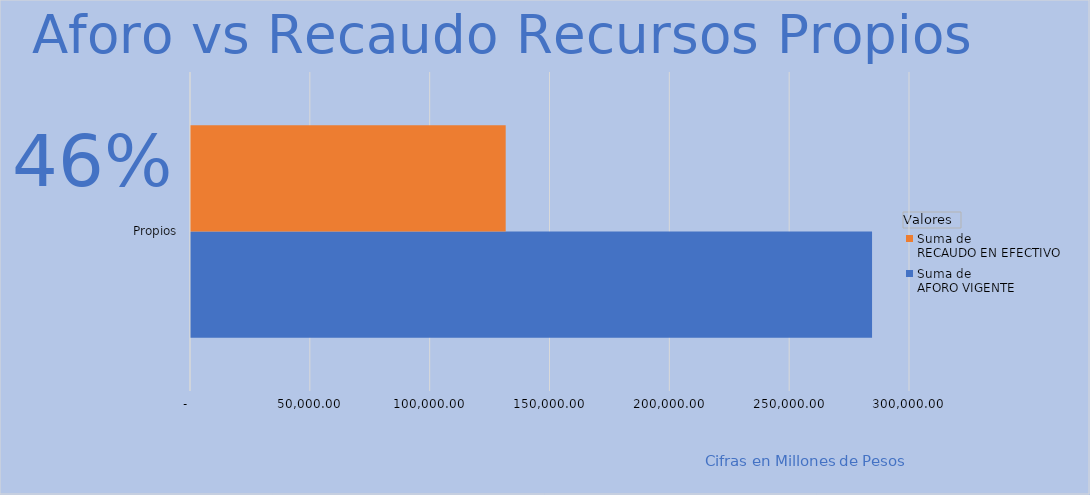
| Category | Suma de 
AFORO VIGENTE
 | Suma de 
RECAUDO EN EFECTIVO 
 |
|---|---|---|
| Propios | 284167 | 131304.527 |